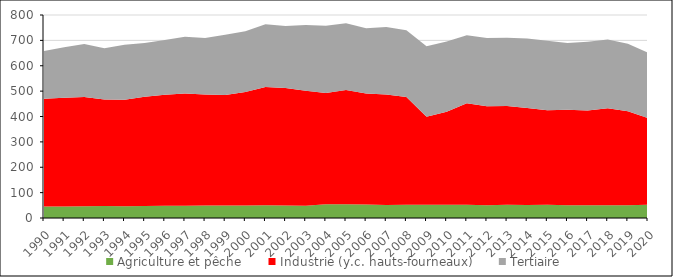
| Category | Agriculture et pêche | Industrie (y.c. hauts-fourneaux) | Tertiaire |
|---|---|---|---|
| 1990.0 | 45.398 | 424.624 | 188.402 |
| 1991.0 | 45.786 | 427.676 | 199.632 |
| 1992.0 | 46.634 | 429.798 | 208.81 |
| 1993.0 | 47.489 | 419.343 | 202.087 |
| 1994.0 | 46.753 | 419.373 | 216.916 |
| 1995.0 | 47.02 | 431.239 | 211.635 |
| 1996.0 | 48.47 | 437.037 | 215.956 |
| 1997.0 | 48.068 | 442.357 | 223.505 |
| 1998.0 | 49.218 | 437.455 | 222.805 |
| 1999.0 | 49.059 | 435.874 | 237.634 |
| 2000.0 | 49.477 | 447.303 | 238.837 |
| 2001.0 | 50.409 | 465.963 | 247.188 |
| 2002.0 | 48.779 | 463.172 | 244.871 |
| 2003.0 | 48.483 | 452.908 | 259.366 |
| 2004.0 | 54.556 | 438.491 | 264.098 |
| 2005.0 | 54.199 | 450.647 | 262.674 |
| 2006.0 | 52.945 | 437.577 | 257.581 |
| 2007.0 | 51.35 | 435.713 | 265.448 |
| 2008.0 | 51.892 | 424.878 | 262.833 |
| 2009.0 | 52.364 | 346.462 | 277.639 |
| 2010.0 | 52.274 | 366.138 | 277.44 |
| 2011.0 | 51.845 | 400.536 | 267.741 |
| 2012.0 | 50.337 | 390.237 | 268.73 |
| 2013.0 | 52.454 | 389.171 | 268.612 |
| 2014.0 | 51.684 | 381.757 | 273.755 |
| 2015.0 | 51.887 | 372.769 | 273.613 |
| 2016.0 | 50.334 | 376.754 | 262.646 |
| 2017.0 | 49.965 | 373.294 | 271.191 |
| 2018.0 | 50.485 | 382.057 | 271.336 |
| 2019.0 | 50.139 | 370.336 | 266.676 |
| 2020.0 | 51.882 | 341.681 | 257.66 |